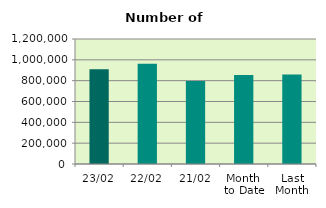
| Category | Series 0 |
|---|---|
| 23/02 | 908706 |
| 22/02 | 962098 |
| 21/02 | 796910 |
| Month 
to Date | 854157.647 |
| Last
Month | 859790.952 |